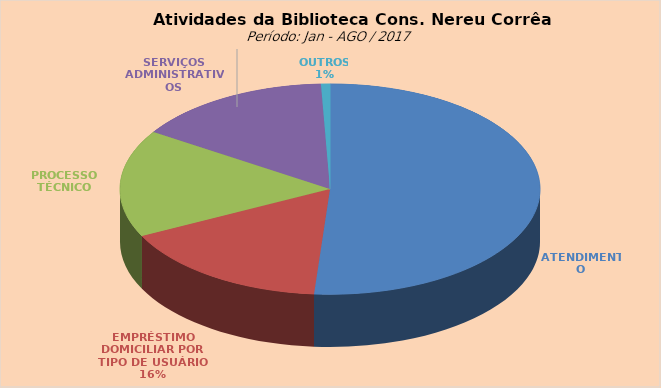
| Category | Series 0 |
|---|---|
| ATENDIMENTO | 9634 |
| EMPRÉSTIMO DOMICILIAR POR TIPO DE USUÁRIO | 3093 |
| PROCESSO TÉCNICO | 3101 |
| SERVIÇOS ADMINISTRATIVOS | 2854 |
| OUTROS | 130 |